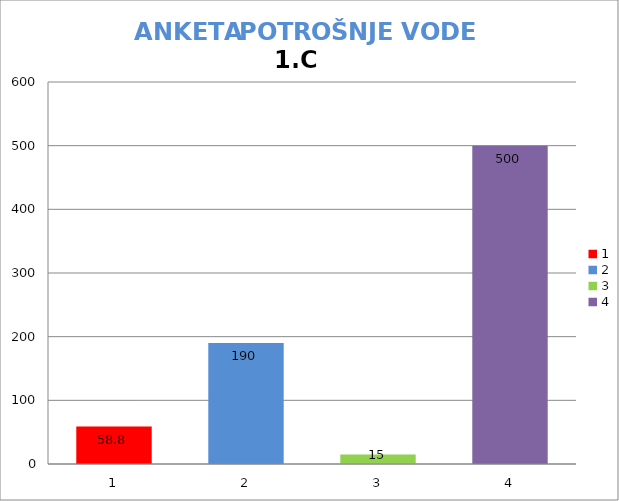
| Category | prosječna potrošnja | stvarna potrošnja | minimalna potrošnja | maksimalna potrošnja |
|---|---|---|---|---|
| 0 | 58.8 |  |  |  |
| 1 | 190 |  |  |  |
| 2 | 15 |  |  |  |
| 3 | 500 |  |  |  |